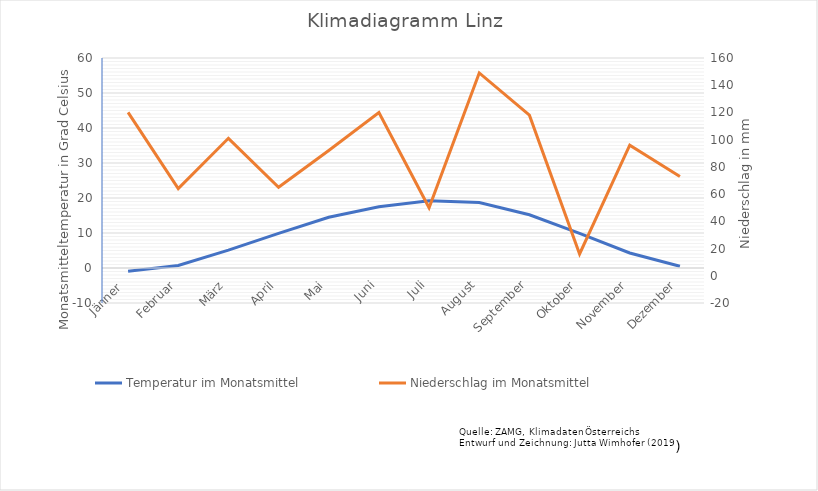
| Category | Temperatur im Monatsmittel |
|---|---|
| Jänner  | -0.9 |
| Februar | 0.7 |
| März | 5.1 |
| April | 9.9 |
| Mai | 14.5 |
| Juni | 17.5 |
| Juli | 19.2 |
| August | 18.7 |
| September | 15.2 |
| Oktober | 9.9 |
| November | 4.3 |
| Dezember | 0.5 |